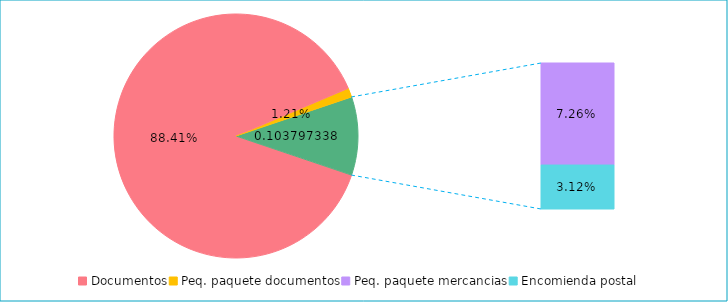
| Category | Series 0 |
|---|---|
| Documentos | 0.884 |
| Peq. paquete documentos | 0.012 |
| Peq. paquete mercancias | 0.073 |
| Encomienda postal | 0.031 |